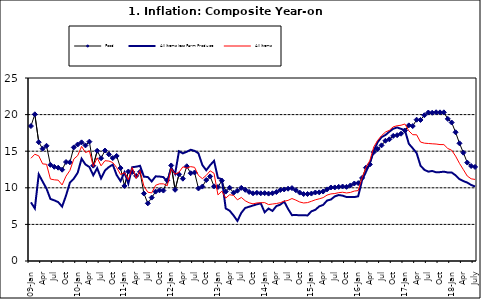
| Category | Food | All Items less Farm Produce | All Items |
|---|---|---|---|
| 09-Jan | 18.436 | 8.013 | 14.034 |
| Feb | 20.041 | 7.178 | 14.584 |
| Mar | 16.233 | 11.842 | 14.366 |
| Apr | 15.342 | 10.85 | 13.268 |
| May | 15.74 | 9.88 | 13.212 |
| June | 13.138 | 8.472 | 11.194 |
| Jul | 12.867 | 8.285 | 11.09 |
| Aug | 12.746 | 8.044 | 11.046 |
| Sep | 12.472 | 7.431 | 10.39 |
| Oct | 13.524 | 8.933 | 11.588 |
| Nov | 13.482 | 10.702 | 12.368 |
| Dec | 15.518 | 11.249 | 13.93 |
| 10-Jan | 15.918 | 12.063 | 14.398 |
| Feb | 16.208 | 13.978 | 15.649 |
| Mar | 15.79 | 13.184 | 14.812 |
| Apr | 16.306 | 12.844 | 15.044 |
| May | 13.023 | 11.711 | 12.915 |
| Jun | 15.053 | 12.686 | 14.099 |
| Jul | 14.043 | 11.287 | 13.002 |
| Aug | 15.09 | 12.366 | 13.702 |
| Sep | 14.57 | 12.83 | 13.65 |
| Oct | 14.065 | 13.168 | 13.45 |
| Nov | 14.351 | 11.746 | 12.766 |
| Dec | 12.701 | 10.917 | 11.815 |
| 11-Jan | 10.255 | 12.118 | 12.08 |
| Feb | 12.221 | 10.569 | 11.1 |
| Mar | 12.169 | 12.815 | 12.779 |
| Apr | 11.629 | 12.882 | 11.291 |
| May | 12.179 | 13.006 | 12.352 |
| Jun | 9.22 | 11.524 | 10.23 |
| Jul | 7.877 | 11.472 | 9.397 |
| Aug | 8.665 | 10.863 | 9.301 |
| Sep | 9.479 | 11.567 | 10.339 |
| Oct | 9.656 | 11.539 | 10.544 |
| Nov | 9.623 | 11.459 | 10.54 |
| Dec | 11.02 | 10.822 | 10.283 |
| 12-Jan | 13.053 | 12.748 | 12.626 |
| 12-Feb | 9.729 | 11.901 | 11.866 |
| 12-Mar | 11.848 | 14.995 | 12.111 |
| Apr | 11.246 | 14.703 | 12.866 |
| May | 12.942 | 14.926 | 12.688 |
| Jun | 11.991 | 15.199 | 12.892 |
| Jul | 12.093 | 15.045 | 12.797 |
| Aug | 9.91 | 14.714 | 11.689 |
| Sep | 10.164 | 13.101 | 11.253 |
| Oct | 11.064 | 12.398 | 11.693 |
| Nov | 11.553 | 13.092 | 12.32 |
| Dec | 10.199 | 13.685 | 11.981 |
| 13-Jan | 10.106 | 11.342 | 9.031 |
| Feb | 10.973 | 11.184 | 9.542 |
| Mar | 9.482 | 7.179 | 8.593 |
| Apr | 10.006 | 6.874 | 9.052 |
| May | 9.321 | 6.227 | 8.964 |
| Jun | 9.606 | 5.472 | 8.353 |
| Jul | 9.994 | 6.58 | 8.682 |
| Aug | 9.723 | 7.245 | 8.231 |
| Sep | 9.437 | 7.41 | 7.952 |
| Oct | 9.249 | 7.579 | 7.807 |
| Nov | 9.313 | 7.75 | 7.931 |
| Dec | 9.253 | 7.872 | 7.957 |
| 14-Jan | 9.271 | 6.648 | 7.977 |
| Feb | 9.207 | 7.166 | 7.707 |
| Mar | 9.254 | 6.836 | 7.783 |
| Apr | 9.414 | 7.508 | 7.851 |
| May | 9.698 | 7.693 | 7.965 |
| Jun | 9.776 | 8.122 | 8.167 |
| Jul | 9.878 | 7.116 | 8.281 |
| Aug | 9.959 | 6.264 | 8.534 |
| Sep | 9.676 | 6.278 | 8.317 |
| Oct | 9.343 | 6.252 | 8.06 |
| Nov | 9.144 | 6.255 | 7.927 |
| Dec | 9.152 | 6.225 | 7.978 |
| 15-Jan | 9.215 | 6.787 | 8.157 |
| Feb | 9.359 | 6.994 | 8.359 |
| Mar | 9.376 | 7.46 | 8.494 |
| Apr | 9.49 | 7.661 | 8.655 |
| May | 9.782 | 8.253 | 9.003 |
| Jun | 10.041 | 8.403 | 9.168 |
| Jul | 10.049 | 8.83 | 9.218 |
| Aug | 10.131 | 9.01 | 9.336 |
| Sep | 10.174 | 8.928 | 9.394 |
| Oct | 10.129 | 8.742 | 9.296 |
| Nov | 10.321 | 8.732 | 9.368 |
| Dec | 10.588 | 8.727 | 9.554 |
| 16-Jan | 10.642 | 8.841 | 9.617 |
| Feb | 11.348 | 11.041 | 11.379 |
| Mar | 12.745 | 12.17 | 12.775 |
| Apr | 13.194 | 13.352 | 13.721 |
| May | 14.861 | 15.054 | 15.577 |
| Jun | 15.302 | 16.224 | 16.48 |
| Jul | 15.799 | 16.929 | 17.127 |
| Aug | 16.427 | 17.208 | 17.609 |
| Sep | 16.622 | 17.666 | 17.852 |
| Oct | 17.09 | 18.067 | 18.33 |
| Nov | 17.191 | 18.241 | 18.476 |
| Dec | 17.388 | 18.052 | 18.547 |
| 17-Jan | 17.818 | 17.867 | 18.719 |
| Feb | 18.528 | 16.011 | 17.78 |
| Mar | 18.436 | 15.404 | 17.256 |
| Apr | 19.303 | 14.75 | 17.244 |
| May | 19.266 | 13.016 | 16.251 |
| Jun | 19.915 | 12.455 | 16.098 |
| Jul | 20.284 | 12.207 | 16.053 |
| Aug | 20.251 | 12.296 | 16.012 |
| Sep | 20.321 | 12.123 | 15.979 |
| Oct | 20.306 | 12.142 | 15.905 |
| Nov | 20.308 | 12.206 | 15.901 |
| Dec | 19.415 | 12.089 | 15.372 |
| 18-Jan | 18.919 | 12.09 | 15.127 |
| Feb | 17.588 | 11.707 | 14.33 |
| Mar | 16.08 | 11.181 | 13.337 |
| Apr | 14.799 | 10.92 | 12.482 |
| May | 13.448 | 10.71 | 11.608 |
| June | 12.977 | 10.387 | 11.231 |
| July | 12.85 | 10.183 | 11.142 |